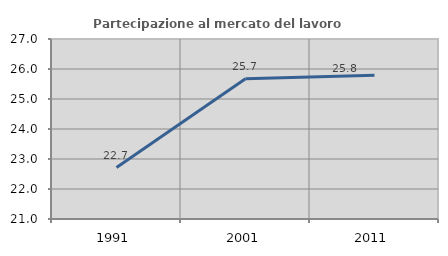
| Category | Partecipazione al mercato del lavoro  femminile |
|---|---|
| 1991.0 | 22.713 |
| 2001.0 | 25.677 |
| 2011.0 | 25.793 |